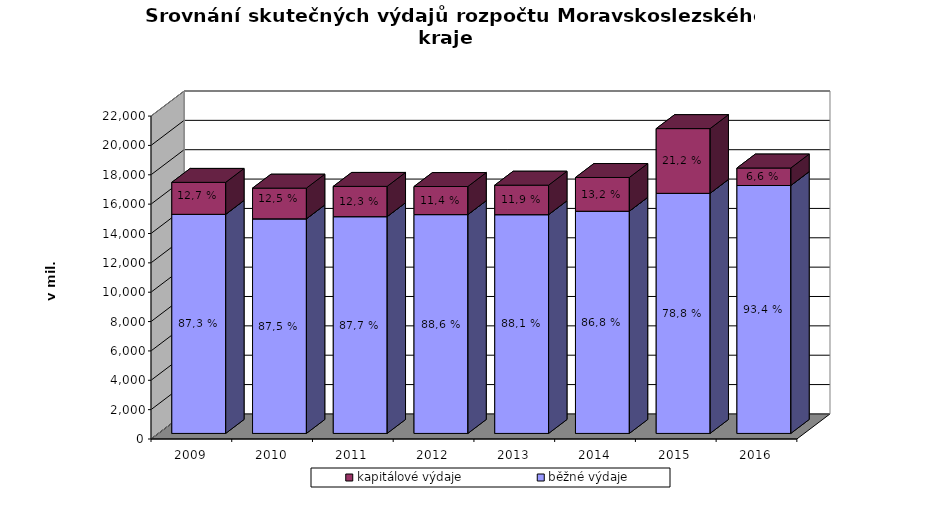
| Category | běžné výdaje | kapitálové výdaje |
|---|---|---|
| 2009.0 | 14927.606 | 2177.358 |
| 2010.0 | 14619.688 | 2091.182 |
| 2011.0 | 14769.003 | 2062.28 |
| 2012.0 | 14909.261 | 1912.375 |
| 2013.0 | 14904.712 | 2009.296 |
| 2014.0 | 15138.14 | 2299.407 |
| 2015.0 | 16356.738 | 4409.991 |
| 2016.0 | 16889.752 | 1192.562 |